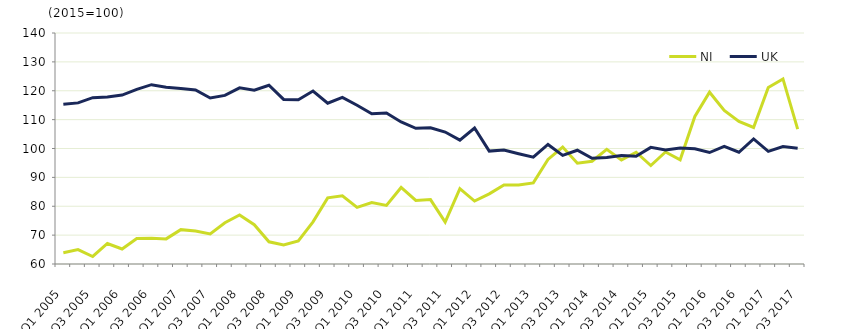
| Category | NI  | UK  |
|---|---|---|
| Q1 2005 | 63.9 | 115.3 |
|  | 65 | 115.8 |
| Q3 2005 | 62.6 | 117.6 |
|  | 67.1 | 117.8 |
| Q1 2006 | 65.2 | 118.5 |
|  | 68.8 | 120.5 |
| Q3 2006 | 68.9 | 122.1 |
|  | 68.7 | 121.2 |
| Q1 2007 | 71.9 | 120.8 |
|  | 71.4 | 120.3 |
| Q3 2007 | 70.4 | 117.5 |
|  | 74.3 | 118.4 |
| Q1 2008 | 77 | 121 |
|  | 73.6 | 120.2 |
| Q3 2008 | 67.7 | 121.9 |
|  | 66.6 | 117 |
| Q1 2009 | 68 | 116.9 |
|  | 74.6 | 119.9 |
| Q3 2009 | 82.9 | 115.7 |
|  | 83.6 | 117.7 |
| Q1 2010 | 79.6 | 115 |
|  | 81.3 | 112 |
| Q3 2010 | 80.3 | 112.3 |
|  | 86.5 | 109.2 |
| Q1 2011 | 82 | 107 |
|  | 82.3 | 107.2 |
| Q3 2011 | 74.5 | 105.7 |
|  | 86.1 | 102.9 |
| Q1 2012 | 81.8 | 107.1 |
|  | 84.3 | 99.1 |
| Q3 2012 | 87.4 | 99.5 |
|  | 87.4 | 98.2 |
| Q1 2013 | 88.1 | 97 |
|  | 96.2 | 101.4 |
| Q3 2013 | 100.5 | 97.6 |
|  | 94.9 | 99.4 |
| Q1 2014 | 95.6 | 96.6 |
|  | 99.7 | 96.9 |
| Q3 2014 | 96 | 97.6 |
|  | 98.7 | 97.3 |
| Q1 2015 | 94.1 | 100.4 |
|  | 98.8 | 99.5 |
| Q3 2015 | 96.1 | 100.2 |
|  | 111.1 | 99.9 |
| Q1 2016 | 119.5 | 98.6 |
|  | 113.2 | 100.7 |
| Q3 2016 | 109.4 | 98.7 |
|  | 107.3 | 103.3 |
| Q1 2017 | 121.1 | 99 |
|  | 124.1 | 100.7 |
| Q3 2017 | 106.7 | 100.1 |